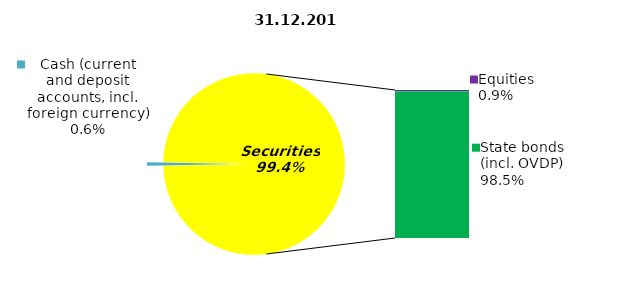
| Category | Series 0 |
|---|---|
| Cash (current and deposit accounts, incl. foreign currency) | 0.769 |
| Bank metals | 0 |
| Real estate | 0 |
| Other Assets | 0 |
| Equities | 1.133 |
| Corporate bonds | 0 |
| Municipal bonds | 0 |
| State bonds (incl. OVDP) | 121.663 |
| Mortgage certificates | 0 |